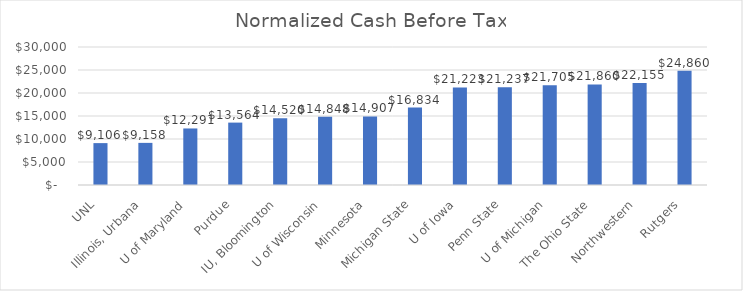
| Category | Series 0 |
|---|---|
|  UNL  | 9105.886 |
|  Illinois, Urbana  | 9157.61 |
|  U of Maryland  | 12290.918 |
|  Purdue  | 13564.15 |
|  IU, Bloomington  | 14520.476 |
|  U of Wisconsin  | 14847.655 |
|  Minnesota  | 14906.703 |
|  Michigan State  | 16833.999 |
|  U of Iowa  | 21222.75 |
|  Penn State  | 21237 |
|  U of Michigan  | 21704.729 |
|  The Ohio State  | 21859.697 |
|  Northwestern  | 22155.011 |
|  Rutgers  | 24859.88 |